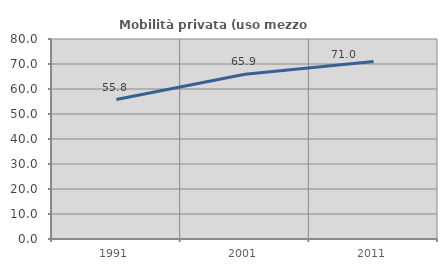
| Category | Mobilità privata (uso mezzo privato) |
|---|---|
| 1991.0 | 55.762 |
| 2001.0 | 65.888 |
| 2011.0 | 70.997 |